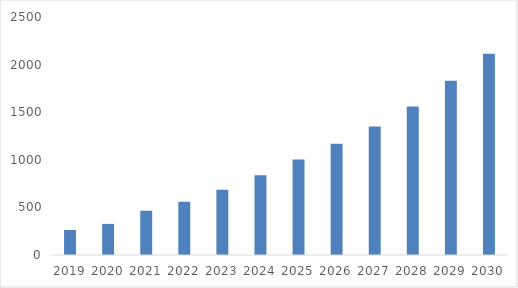
| Category | Lithium  |
|---|---|
| 2019.0 | 263 |
| 2020.0 | 327 |
| 2021.0 | 465 |
| 2022.0 | 559 |
| 2023.0 | 685 |
| 2024.0 | 838 |
| 2025.0 | 1003 |
| 2026.0 | 1169 |
| 2027.0 | 1349 |
| 2028.0 | 1560 |
| 2029.0 | 1831 |
| 2030.0 | 2114 |